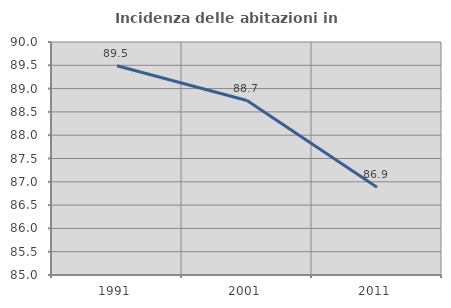
| Category | Incidenza delle abitazioni in proprietà  |
|---|---|
| 1991.0 | 89.491 |
| 2001.0 | 88.744 |
| 2011.0 | 86.885 |